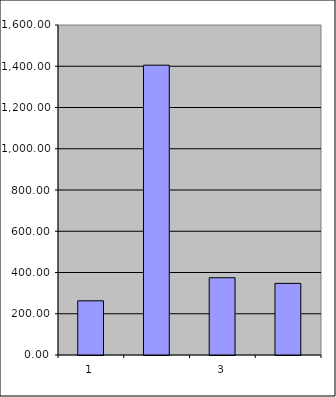
| Category | Series 0 |
|---|---|
| 0 | 262.75 |
| 1 | 1405.201 |
| 2 | 374.479 |
| 3 | 347.253 |